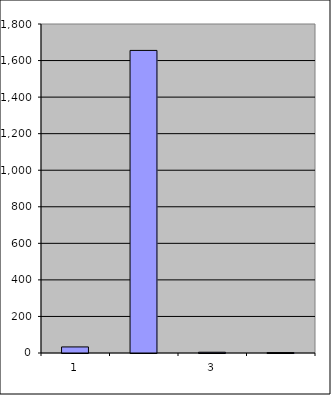
| Category | Series 0 |
|---|---|
| 0 | 33.25 |
| 1 | 1655.481 |
| 2 | 4.143 |
| 3 | 2.417 |